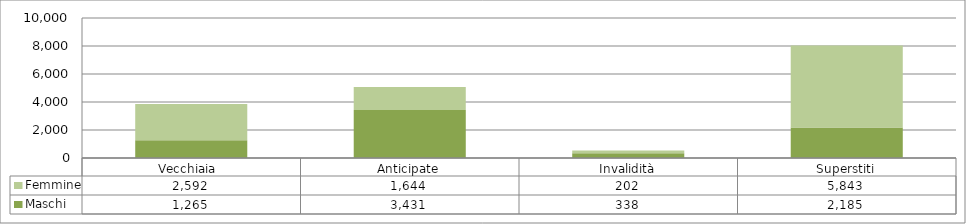
| Category | Maschi | Femmine |
|---|---|---|
| Vecchiaia  | 1265 | 2592 |
| Anticipate | 3431 | 1644 |
| Invalidità | 338 | 202 |
| Superstiti | 2185 | 5843 |